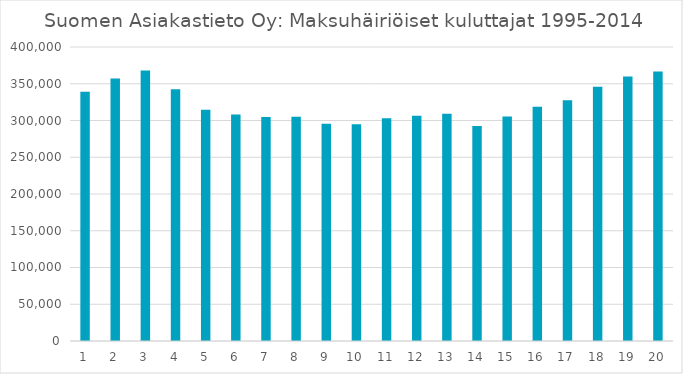
| Category | Series 0 |
|---|---|
| 0 | 339100 |
| 1 | 357000 |
| 2 | 368000 |
| 3 | 342500 |
| 4 | 314600 |
| 5 | 308200 |
| 6 | 304800 |
| 7 | 305200 |
| 8 | 295700 |
| 9 | 294900 |
| 10 | 303200 |
| 11 | 306600 |
| 12 | 309300 |
| 13 | 292500 |
| 14 | 305400 |
| 15 | 318700 |
| 16 | 327500 |
| 17 | 346000 |
| 18 | 360000 |
| 19 | 366700 |